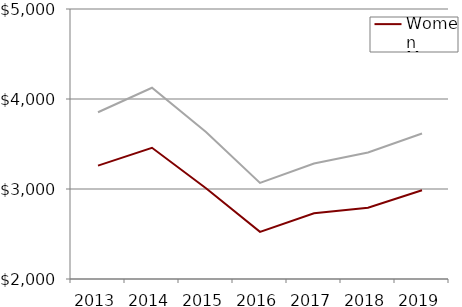
| Category | Women | Men |
|---|---|---|
| 2013.0 | 3260 | 3853 |
| 2014.0 | 3458 | 4125 |
| 2015.0 | 3007.583 | 3634 |
| 2016.0 | 2524 | 3068 |
| 2017.0 | 2730 | 3283 |
| 2018.0 | 2791 | 3406 |
| 2019.0 | 2986 | 3616 |